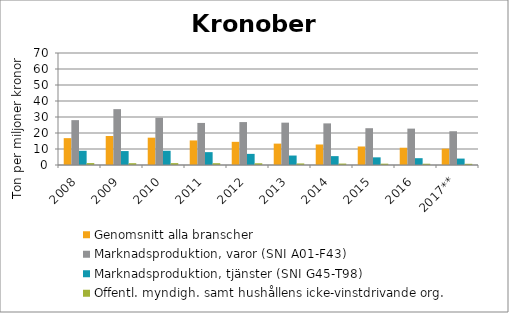
| Category | Genomsnitt alla branscher | Marknadsproduktion, varor (SNI A01-F43) | Marknadsproduktion, tjänster (SNI G45-T98) | Offentl. myndigh. samt hushållens icke-vinstdrivande org. |
|---|---|---|---|---|
| 2008 | 16.785 | 28.04 | 8.873 | 1.201 |
| 2009 | 18.138 | 34.908 | 8.71 | 1.129 |
| 2010 | 17.082 | 29.549 | 8.898 | 1.173 |
| 2011 | 15.346 | 26.291 | 8.035 | 1.128 |
| 2012 | 14.478 | 26.831 | 6.955 | 1.082 |
| 2013 | 13.365 | 26.467 | 5.914 | 0.975 |
| 2014 | 12.817 | 26.008 | 5.545 | 0.895 |
| 2015 | 11.562 | 22.995 | 4.789 | 0.834 |
| 2016 | 10.79 | 22.742 | 4.26 | 0.802 |
| 2017** | 10.207 | 21.101 | 4.012 | 0.745 |